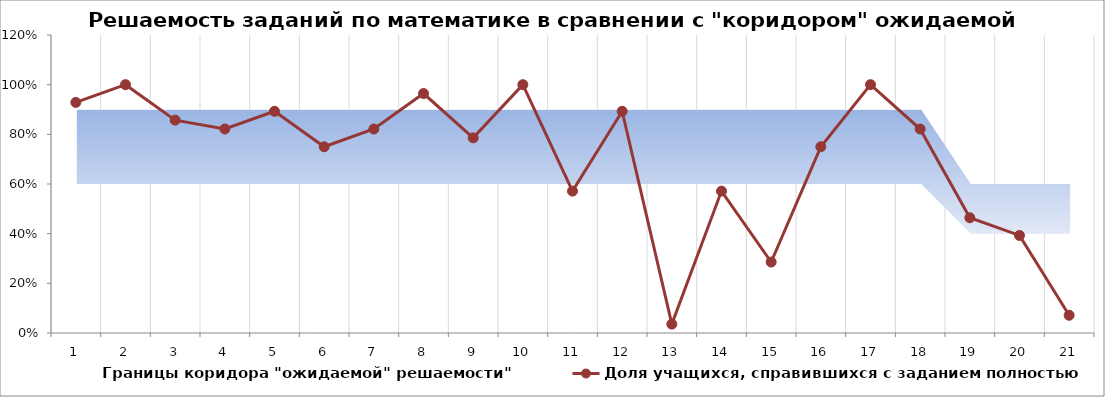
| Category | Границы коридора "ожидаемой" решаемости" | Границы коридора "ожидаемой" решаемости |
|---|---|---|
| 1.0 | 0.6 | 0.3 |
| 2.0 | 0.6 | 0.3 |
| 3.0 | 0.6 | 0.3 |
| 4.0 | 0.6 | 0.3 |
| 5.0 | 0.6 | 0.3 |
| 6.0 | 0.6 | 0.3 |
| 7.0 | 0.6 | 0.3 |
| 8.0 | 0.6 | 0.3 |
| 9.0 | 0.6 | 0.3 |
| 10.0 | 0.6 | 0.3 |
| 11.0 | 0.6 | 0.3 |
| 12.0 | 0.6 | 0.3 |
| 13.0 | 0.6 | 0.3 |
| 14.0 | 0.6 | 0.3 |
| 15.0 | 0.6 | 0.3 |
| 16.0 | 0.6 | 0.3 |
| 17.0 | 0.6 | 0.3 |
| 18.0 | 0.6 | 0.3 |
| 19.0 | 0.4 | 0.2 |
| 20.0 | 0.4 | 0.2 |
| 21.0 | 0.4 | 0.2 |